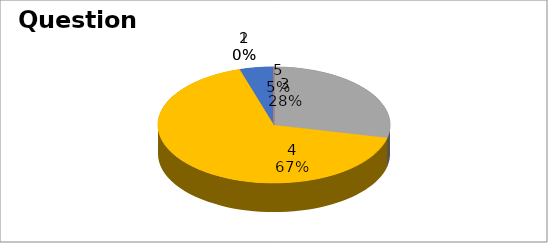
| Category | Series 0 |
|---|---|
| 0 | 0 |
| 1 | 0 |
| 2 | 6 |
| 3 | 14 |
| 4 | 1 |